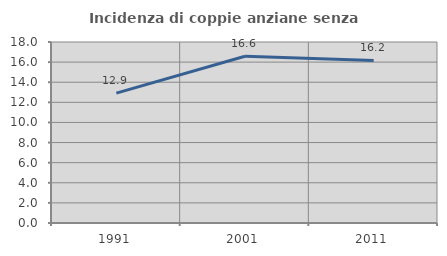
| Category | Incidenza di coppie anziane senza figli  |
|---|---|
| 1991.0 | 12.919 |
| 2001.0 | 16.578 |
| 2011.0 | 16.168 |